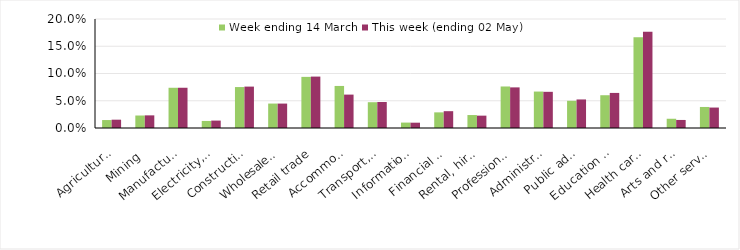
| Category | Week ending 14 March | This week (ending 02 May) |
|---|---|---|
| Agriculture, forestry and fishing | 0.015 | 0.015 |
| Mining | 0.023 | 0.023 |
| Manufacturing | 0.074 | 0.074 |
| Electricity, gas, water and waste services | 0.013 | 0.014 |
| Construction | 0.075 | 0.076 |
| Wholesale trade | 0.045 | 0.045 |
| Retail trade | 0.094 | 0.094 |
| Accommodation and food services | 0.077 | 0.061 |
| Transport, postal and warehousing | 0.047 | 0.048 |
| Information media and telecommunications | 0.01 | 0.01 |
| Financial and insurance services | 0.029 | 0.031 |
| Rental, hiring and real estate services | 0.024 | 0.023 |
| Professional, scientific and technical services | 0.076 | 0.075 |
| Administrative and support services | 0.067 | 0.066 |
| Public administration and safety | 0.05 | 0.052 |
| Education and training | 0.06 | 0.064 |
| Health care and social assistance | 0.166 | 0.177 |
| Arts and recreation services | 0.017 | 0.015 |
| Other services | 0.039 | 0.038 |